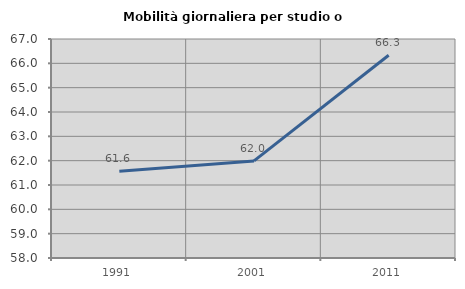
| Category | Mobilità giornaliera per studio o lavoro |
|---|---|
| 1991.0 | 61.565 |
| 2001.0 | 61.991 |
| 2011.0 | 66.332 |